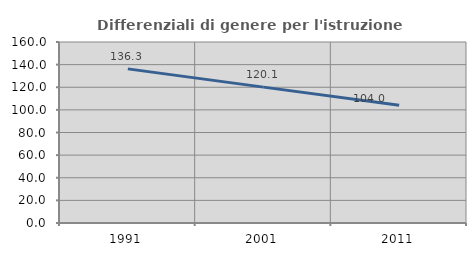
| Category | Differenziali di genere per l'istruzione superiore |
|---|---|
| 1991.0 | 136.254 |
| 2001.0 | 120.107 |
| 2011.0 | 104.035 |